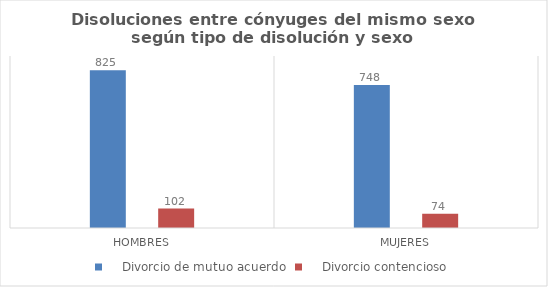
| Category |     Divorcio de mutuo acuerdo |     Divorcio contencioso |
|---|---|---|
| Hombres | 825 | 102 |
| Mujeres | 748 | 74 |